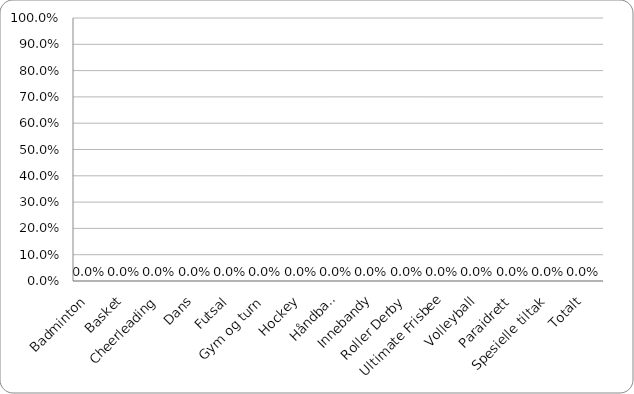
| Category | Series 0 |
|---|---|
| Badminton | 0 |
| Basket | 0 |
| Cheerleading | 0 |
| Dans | 0 |
| Futsal | 0 |
| Gym og turn | 0 |
| Hockey | 0 |
| Håndball | 0 |
| Innebandy | 0 |
| Roller Derby | 0 |
| Ultimate Frisbee | 0 |
| Volleyball | 0 |
| Paraidrett | 0 |
| Spesielle tiltak | 0 |
| Totalt | 0 |